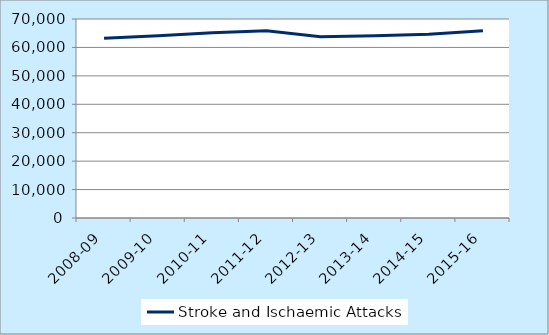
| Category | Stroke and Ischaemic Attacks |
|---|---|
| 2008-09 | 63256 |
| 2009-10 | 64132 |
| 2010-11 | 65203 |
| 2011-12 | 65854 |
| 2012-13 | 63724 |
| 2013-14 | 64093 |
| 2014-15 | 64641 |
| 2015-16 | 65855 |